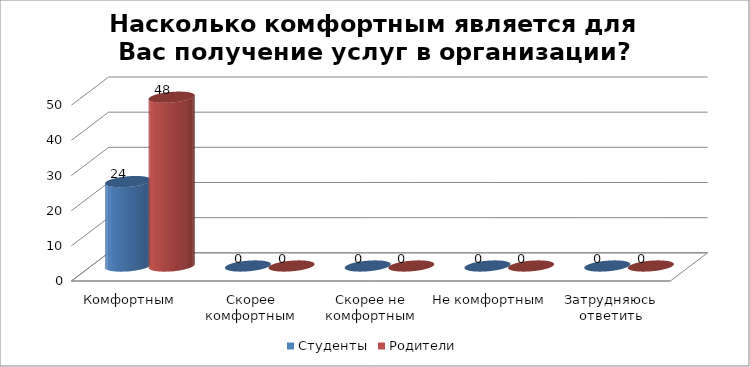
| Category | Студенты | Родители |
|---|---|---|
| Комфортным | 24 | 48 |
| Скорее комфортным | 0 | 0 |
| Скорее не комфортным | 0 | 0 |
| Не комфортным | 0 | 0 |
| Затрудняюсь ответить | 0 | 0 |